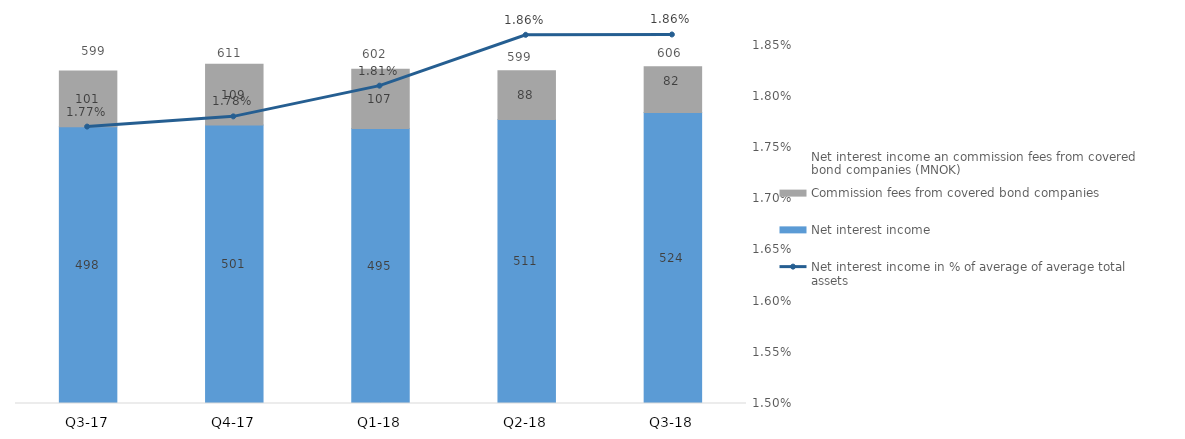
| Category | Net interest income | Commission fees from covered bond companies |
|---|---|---|
| Q3-18 | 523.87 | 81.9 |
| Q2-18 | 511.1 | 87.5 |
| Q1-18 | 495 | 106.7 |
| Q4-17 | 501.2 | 109.3 |
| Q3-17 | 498 | 100.5 |